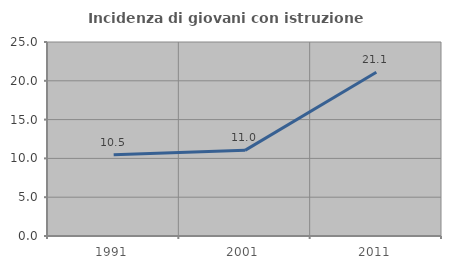
| Category | Incidenza di giovani con istruzione universitaria |
|---|---|
| 1991.0 | 10.484 |
| 2001.0 | 11.039 |
| 2011.0 | 21.094 |